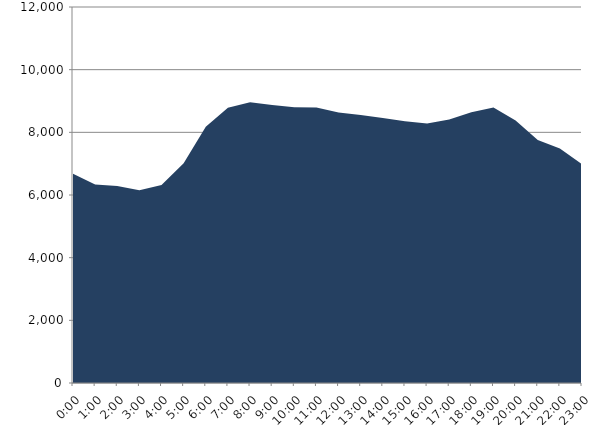
| Category | Series 0 | Series 1 |
|---|---|---|
| 2022-09-21 |  | 6681.83 |
| 2022-09-21 01:00:00 |  | 6333.44 |
| 2022-09-21 02:00:00 |  | 6284.65 |
| 2022-09-21 03:00:00 |  | 6154.3 |
| 2022-09-21 04:00:00 |  | 6320.98 |
| 2022-09-21 05:00:00 |  | 7015.34 |
| 2022-09-21 06:00:00 |  | 8180.51 |
| 2022-09-21 07:00:00 |  | 8783.12 |
| 2022-09-21 08:00:00 |  | 8956.99 |
| 2022-09-21 09:00:00 |  | 8869.05 |
| 2022-09-21 10:00:00 |  | 8801.05 |
| 2022-09-21 11:00:00 |  | 8791.56 |
| 2022-09-21 12:00:00 |  | 8631.31 |
| 2022-09-21 13:00:00 |  | 8554.17 |
| 2022-09-21 14:00:00 |  | 8458.61 |
| 2022-09-21 15:00:00 |  | 8355.2 |
| 2022-09-21 16:00:00 |  | 8280.66 |
| 2022-09-21 17:00:00 |  | 8407.42 |
| 2022-09-21 18:00:00 |  | 8641.26 |
| 2022-09-21 19:00:00 |  | 8795.51 |
| 2022-09-21 20:00:00 |  | 8379.18 |
| 2022-09-21 21:00:00 |  | 7752.26 |
| 2022-09-21 22:00:00 |  | 7483.47 |
| 2022-09-21 23:00:00 |  | 6982.89 |